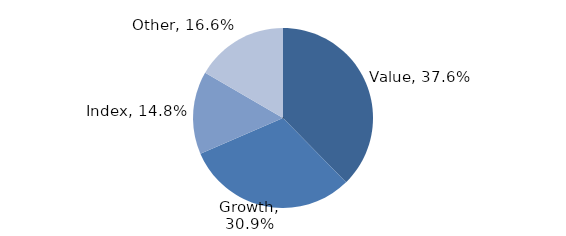
| Category | Investment Style |
|---|---|
| Value | 0.376 |
| Growth | 0.309 |
| Index | 0.148 |
| Other | 0.166 |